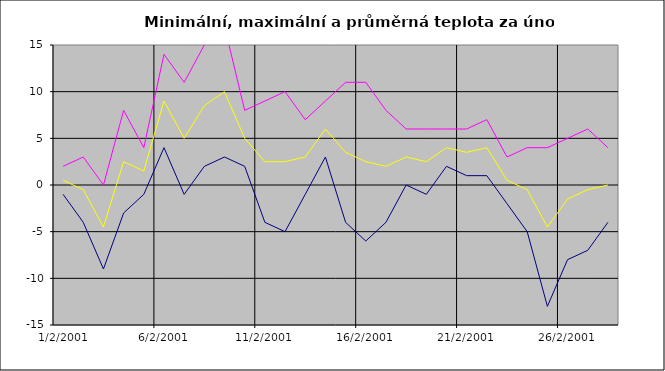
| Category | Series 0 | Series 1 | Series 2 |
|---|---|---|---|
| 2001-02-01 | -1 | 2 | 0.5 |
| 2001-02-02 | -4 | 3 | -0.5 |
| 2001-02-03 | -9 | 0 | -4.5 |
| 2001-02-04 | -3 | 8 | 2.5 |
| 2001-02-05 | -1 | 4 | 1.5 |
| 2001-02-06 | 4 | 14 | 9 |
| 2001-02-07 | -1 | 11 | 5 |
| 2001-02-08 | 2 | 15 | 8.5 |
| 2001-02-09 | 3 | 17 | 10 |
| 2001-02-10 | 2 | 8 | 5 |
| 2001-02-11 | -4 | 9 | 2.5 |
| 2001-02-12 | -5 | 10 | 2.5 |
| 2001-02-13 | -1 | 7 | 3 |
| 2001-02-14 | 3 | 9 | 6 |
| 2001-02-15 | -4 | 11 | 3.5 |
| 2001-02-16 | -6 | 11 | 2.5 |
| 2001-02-17 | -4 | 8 | 2 |
| 2001-02-18 | 0 | 6 | 3 |
| 2001-02-19 | -1 | 6 | 2.5 |
| 2001-02-20 | 2 | 6 | 4 |
| 2001-02-21 | 1 | 6 | 3.5 |
| 2001-02-22 | 1 | 7 | 4 |
| 2001-02-23 | -2 | 3 | 0.5 |
| 2001-02-24 | -5 | 4 | -0.5 |
| 2001-02-25 | -13 | 4 | -4.5 |
| 2001-02-26 | -8 | 5 | -1.5 |
| 2001-02-27 | -7 | 6 | -0.5 |
| 2001-02-28 | -4 | 4 | 0 |